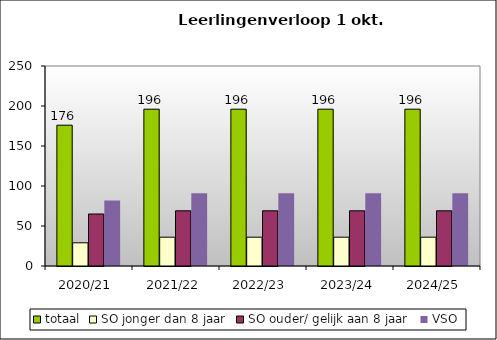
| Category | totaal | SO jonger dan 8 jaar | SO ouder/ gelijk aan 8 jaar | VSO |
|---|---|---|---|---|
| 2020/21 | 176 | 29 | 65 | 82 |
| 2021/22 | 196 | 36 | 69 | 91 |
| 2022/23 | 196 | 36 | 69 | 91 |
| 2023/24 | 196 | 36 | 69 | 91 |
| 2024/25 | 196 | 36 | 69 | 91 |